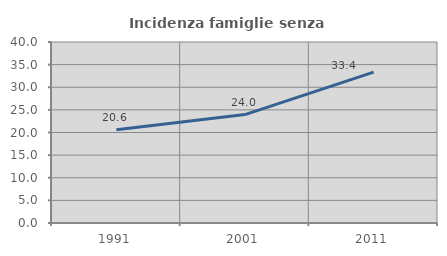
| Category | Incidenza famiglie senza nuclei |
|---|---|
| 1991.0 | 20.595 |
| 2001.0 | 23.96 |
| 2011.0 | 33.355 |